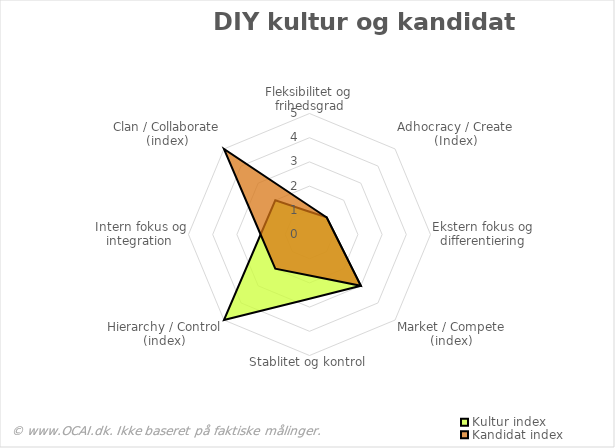
| Category | Kultur index | Kandidat index |
|---|---|---|
| Fleksibilitet og frihedsgrad | 0.943 | 1.179 |
| Adhocracy / Create (Index) | 1 | 1 |
| Ekstern fokus og differentiering | 1.061 | 1.061 |
| Market / Compete (index) | 3 | 3 |
| Stablitet og kontrol | 2.652 | 1.697 |
| Hierarchy / Control (index) | 5 | 2 |
| Intern fokus og integration  | 2.02 | 2.02 |
| Clan / Collaborate (index) | 2 | 5 |